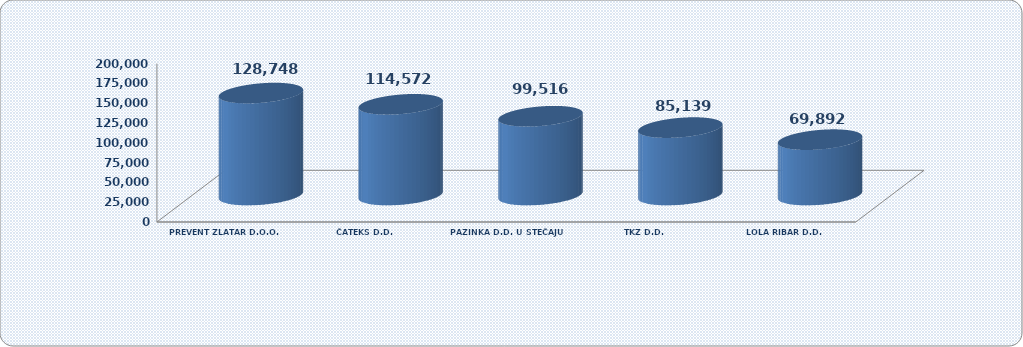
| Category | Ukupan prihod |
|---|---|
| PREVENT ZLATAR D.O.O. | 128747.618 |
| ČATEKS D.D. | 114572.433 |
| PAZINKA D.D. U STEČAJU PAZIN | 99516.46 |
| TKZ D.D. | 85139.312 |
| LOLA RIBAR D.D. | 69892.433 |